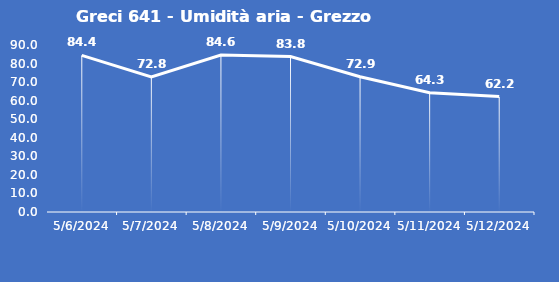
| Category | Greci 641 - Umidità aria - Grezzo (%) |
|---|---|
| 5/6/24 | 84.4 |
| 5/7/24 | 72.8 |
| 5/8/24 | 84.6 |
| 5/9/24 | 83.8 |
| 5/10/24 | 72.9 |
| 5/11/24 | 64.3 |
| 5/12/24 | 62.2 |